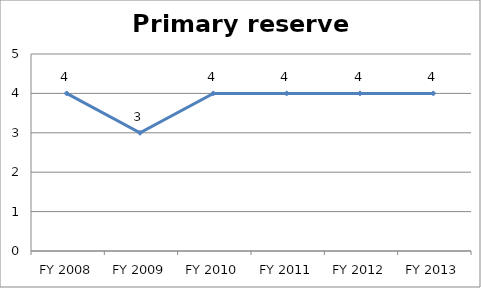
| Category | Primary reserve score |
|---|---|
| FY 2013 | 4 |
| FY 2012 | 4 |
| FY 2011 | 4 |
| FY 2010 | 4 |
| FY 2009 | 3 |
| FY 2008 | 4 |